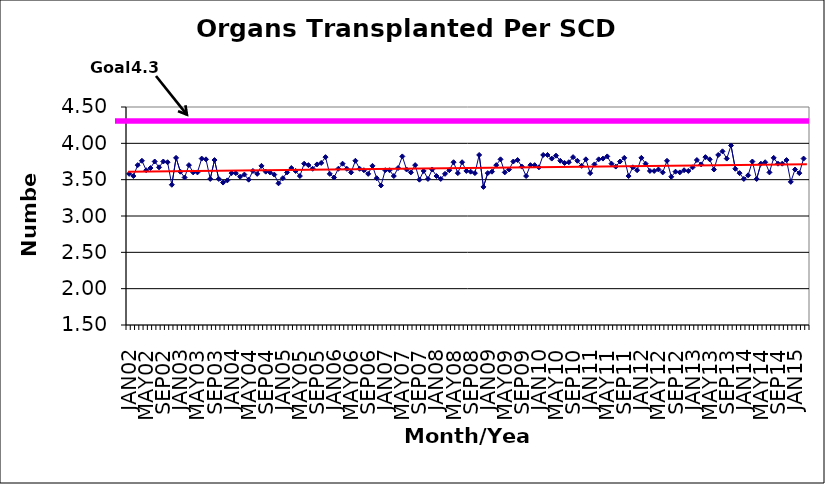
| Category | Series 0 |
|---|---|
| JAN02 | 3.58 |
| FEB02 | 3.55 |
| MAR02 | 3.7 |
| APR02 | 3.76 |
| MAY02 | 3.63 |
| JUN02 | 3.66 |
| JUL02 | 3.75 |
| AUG02 | 3.67 |
| SEP02 | 3.75 |
| OCT02 | 3.74 |
| NOV02 | 3.43 |
| DEC02 | 3.8 |
| JAN03 | 3.61 |
| FEB03 | 3.53 |
| MAR03 | 3.7 |
| APR03 | 3.6 |
| MAY03 | 3.6 |
| JUN03 | 3.79 |
| JUL03 | 3.78 |
| AUG03 | 3.51 |
| SEP03 | 3.77 |
| OCT03 | 3.51 |
| NOV03 | 3.46 |
| DEC03 | 3.49 |
| JAN04 | 3.59 |
| FEB04 | 3.59 |
| MAR04 | 3.54 |
| APR04 | 3.57 |
| MAY04 | 3.5 |
| JUN04 | 3.62 |
| JUL04 | 3.58 |
| AUG04 | 3.69 |
| SEP04 | 3.61 |
| OCT04 | 3.6 |
| NOV04 | 3.57 |
| DEC04 | 3.45 |
| JAN05 | 3.52 |
| FEB05 | 3.6 |
| MAR05 | 3.66 |
| APR05 | 3.62 |
| MAY05 | 3.55 |
| JUN05 | 3.72 |
| JUL05 | 3.7 |
| AUG05 | 3.65 |
| SEP05 | 3.71 |
| OCT05 | 3.73 |
| NOV05 | 3.81 |
| DEC05 | 3.58 |
| JAN06 | 3.53 |
| FEB06 | 3.65 |
| MAR06 | 3.72 |
| APR06 | 3.65 |
| MAY06 | 3.6 |
| JUN06 | 3.76 |
| JUL06 | 3.65 |
| AUG06 | 3.63 |
| SEP06 | 3.58 |
| OCT06 | 3.69 |
| NOV06 | 3.52 |
| DEC06 | 3.42 |
| JAN07 | 3.63 |
| FEB07 | 3.63 |
| MAR07 | 3.55 |
| APR07 | 3.66 |
| MAY07 | 3.82 |
| JUN07 | 3.64 |
| JUL07 | 3.6 |
| AUG07 | 3.7 |
| SEP07 | 3.5 |
| OCT07 | 3.62 |
| NOV07 | 3.51 |
| DEC07 | 3.64 |
| JAN08 | 3.55 |
| FEB08 | 3.51 |
| MAR08 | 3.58 |
| APR08 | 3.63 |
| MAY08 | 3.74 |
| JUN08 | 3.59 |
| JUL08 | 3.74 |
| AUG08 | 3.62 |
| SEP08 | 3.61 |
| OCT08 | 3.59 |
| NOV08 | 3.84 |
| DEC08 | 3.4 |
| JAN09 | 3.59 |
| FEB09 | 3.61 |
| MAR09 | 3.7 |
| APR09 | 3.78 |
| MAY09 | 3.6 |
| JUN09 | 3.64 |
| JUL09 | 3.75 |
| AUG09 | 3.77 |
| SEP09 | 3.68 |
| OCT09 | 3.55 |
| NOV09 | 3.7 |
| DEC09 | 3.7 |
| JAN10 | 3.67 |
| FEB10 | 3.84 |
| MAR10 | 3.84 |
| APR10 | 3.79 |
| MAY10 | 3.83 |
| JUN10 | 3.76 |
| JUL10 | 3.73 |
| AUG10 | 3.74 |
| SEP10 | 3.81 |
| OCT10 | 3.76 |
| NOV10 | 3.69 |
| DEC10 | 3.78 |
| JAN11 | 3.59 |
| FEB11 | 3.71 |
| MAR11 | 3.78 |
| APR11 | 3.79 |
| MAY11 | 3.82 |
| JUN11 | 3.72 |
| JUL11 | 3.68 |
| AUG11 | 3.75 |
| SEP11 | 3.8 |
| OCT11 | 3.55 |
| NOV11 | 3.67 |
| DEC11 | 3.63 |
| JAN12 | 3.8 |
| FEB12 | 3.72 |
| MAR12 | 3.62 |
| APR12 | 3.62 |
| MAY12 | 3.64 |
| JUN12 | 3.6 |
| JUL12 | 3.76 |
| AUG12 | 3.54 |
| SEP12 | 3.61 |
| OCT12 | 3.6 |
| NOV12 | 3.63 |
| DEC12 | 3.62 |
| JAN13 | 3.67 |
| FEB13 | 3.77 |
| MAR13 | 3.71 |
| APR13 | 3.81 |
| MAY13 | 3.78 |
| JUN13 | 3.64 |
| JUL13 | 3.84 |
| AUG13 | 3.89 |
| SEP13 | 3.79 |
| OCT13 | 3.97 |
| NOV13 | 3.65 |
| DEC13 | 3.59 |
| JAN14 | 3.51 |
| FEB14 | 3.56 |
| MAR14 | 3.75 |
| APR14 | 3.51 |
| MAY14 | 3.72 |
| JUN14 | 3.74 |
| JUL14 | 3.6 |
| AUG14 | 3.8 |
| SEP14 | 3.72 |
| OCT14 | 3.72 |
| NOV14 | 3.77 |
| DEC14 | 3.47 |
| JAN15 | 3.64 |
| FEB15 | 3.59 |
| MAR15 | 3.79 |